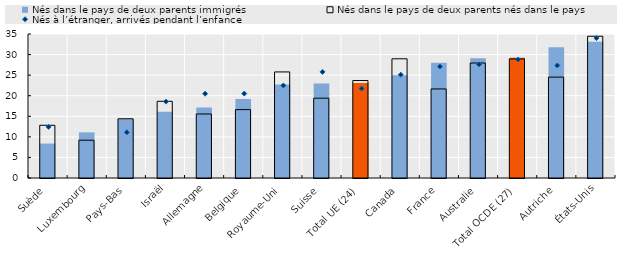
| Category | Nés dans le pays de deux parents immigrés | Nés dans le pays de deux parents nés dans le pays |
|---|---|---|
| Suède | 8.365 | 12.816 |
| Luxembourg | 11.1 | 9.19 |
| Pays-Bas | 14.286 | 14.392 |
| Israël | 16.13 | 18.64 |
| Allemagne | 17.105 | 15.561 |
| Belgique | 19.223 | 16.616 |
| Royaume-Uni | 22.75 | 25.78 |
| Suisse | 22.96 | 19.4 |
| Total UE (24) | 23.079 | 23.692 |
| Canada | 24.977 | 28.973 |
| France | 28 | 21.645 |
| Australie | 29.135 | 27.95 |
| Total OCDE (27) | 29.244 | 28.938 |
| Autriche | 31.776 | 24.521 |
| États-Unis | 33.111 | 34.456 |